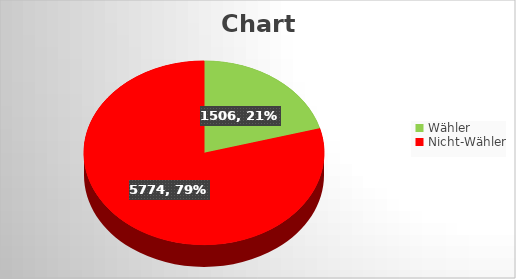
| Category | Series 0 |
|---|---|
| Wähler   | 1506 |
| Nicht-Wähler | 5774 |